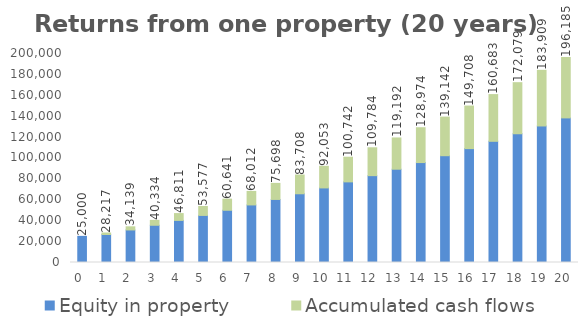
| Category | Equity in property  | Accumulated cash flows  | Total equity  |
|---|---|---|---|
| 0.0 | 25000 | 0 | 25000 |
| 1.0 | 26783.02 | 1434.308 | 28217.328 |
| 2.0 | 31138.182 | 3000.772 | 34138.954 |
| 3.0 | 35631.92 | 4702.405 | 40334.325 |
| 4.0 | 40268.402 | 6542.584 | 46810.987 |
| 5.0 | 45052.436 | 8524.668 | 53577.104 |
| 6.0 | 49988.998 | 10652.09 | 60641.088 |
| 7.0 | 55083.245 | 12928.362 | 68011.607 |
| 8.0 | 60340.513 | 15357.077 | 75697.591 |
| 9.0 | 65766.333 | 17941.909 | 83708.241 |
| 10.0 | 71366.429 | 20686.613 | 92053.042 |
| 11.0 | 77146.733 | 23595.032 | 100741.765 |
| 12.0 | 83113.388 | 26671.093 | 109784.481 |
| 13.0 | 89272.758 | 29918.812 | 119191.569 |
| 14.0 | 95631.434 | 33342.294 | 128973.728 |
| 15.0 | 102196.245 | 36945.738 | 139141.983 |
| 16.0 | 108974.268 | 40733.433 | 149707.701 |
| 17.0 | 115972.831 | 44709.766 | 160682.598 |
| 18.0 | 123199.531 | 48879.219 | 172078.75 |
| 19.0 | 130662.237 | 53246.373 | 183908.61 |
| 20.0 | 138369.103 | 57815.911 | 196185.014 |